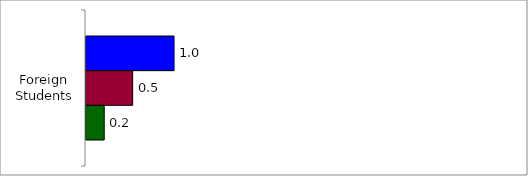
| Category | 50 States and D.C. | SREB States | State |
|---|---|---|---|
| Foreign Students | 1.017 | 0.539 | 0.21 |